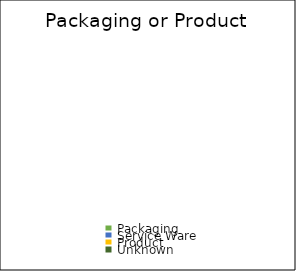
| Category | Series 0 |
|---|---|
| Intact/ Un-fouled | 0 |
| Degraded/ Heavily Fouled | 0 |